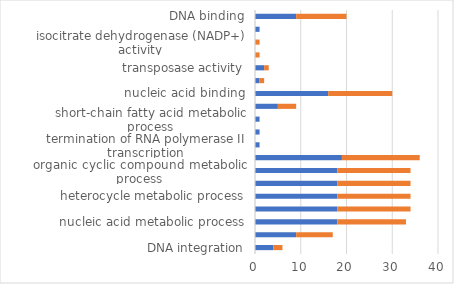
| Category | up-regulated | down-regulated |
|---|---|---|
| DNA integration | 4 | 2 |
| DNA metabolic process | 9 | 8 |
| nucleic acid metabolic process | 18 | 15 |
| nucleobase-containing compound metabolic process | 18 | 16 |
| heterocycle metabolic process | 18 | 16 |
| cellular aromatic compound metabolic process | 18 | 16 |
| organic cyclic compound metabolic process | 18 | 16 |
| cellular nitrogen compound metabolic process | 19 | 17 |
| termination of RNA polymerase II transcription | 1 | 0 |
| butyrate metabolic process | 1 | 0 |
| short-chain fatty acid metabolic process | 1 | 0 |
| protein dimerization activity | 5 | 4 |
| nucleic acid binding | 16 | 14 |
| structural constituent of cuticle | 1 | 1 |
| transposase activity | 2 | 1 |
| isocitrate dehydrogenase activity | 0 | 1 |
| isocitrate dehydrogenase (NADP+) activity | 0 | 1 |
| hydroxybutyrate-dimer hydrolase activity | 1 | 0 |
| DNA binding | 9 | 11 |